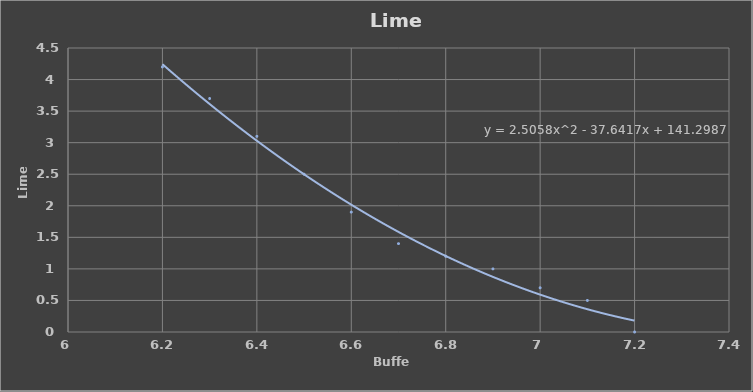
| Category | Series 0 |
|---|---|
| 6.2 | 4.2 |
| 6.3 | 3.7 |
| 6.4 | 3.1 |
| 6.5 | 2.5 |
| 6.6 | 1.9 |
| 6.7 | 1.4 |
| 6.8 | 1.2 |
| 6.9 | 1 |
| 7.0 | 0.7 |
| 7.1 | 0.5 |
| 7.2 | 0 |